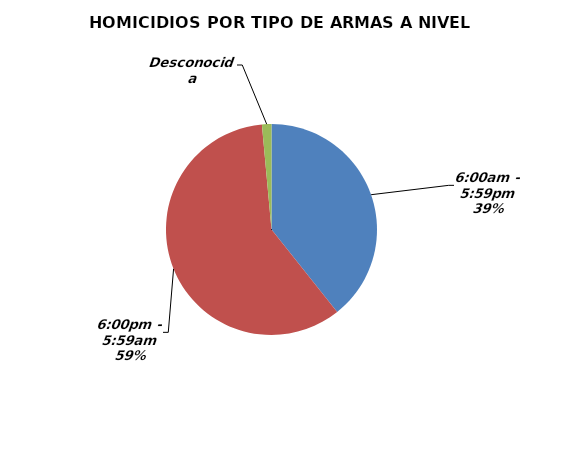
| Category | Series 0 |
|---|---|
| 6:00am - 5:59pm | 487 |
| 6:00pm - 5:59am | 734 |
| Desconocida | 18 |